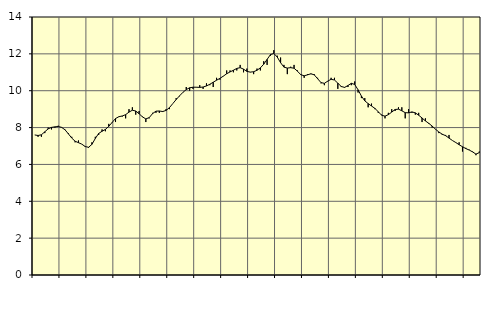
| Category | Piggar | Series 1 |
|---|---|---|
| nan | 7.6 | 7.6 |
| 87.0 | 7.5 | 7.57 |
| 87.0 | 7.5 | 7.61 |
| 87.0 | 7.7 | 7.77 |
| nan | 8 | 7.93 |
| 88.0 | 7.9 | 8.01 |
| 88.0 | 8 | 8.04 |
| 88.0 | 8.1 | 8.06 |
| nan | 8 | 8.01 |
| 89.0 | 7.9 | 7.88 |
| 89.0 | 7.7 | 7.66 |
| 89.0 | 7.5 | 7.43 |
| nan | 7.2 | 7.26 |
| 90.0 | 7.3 | 7.18 |
| 90.0 | 7.1 | 7.1 |
| 90.0 | 7 | 6.97 |
| nan | 6.9 | 6.93 |
| 91.0 | 7.2 | 7.09 |
| 91.0 | 7.5 | 7.41 |
| 91.0 | 7.6 | 7.68 |
| nan | 7.9 | 7.8 |
| 92.0 | 7.8 | 7.9 |
| 92.0 | 8.2 | 8.07 |
| 92.0 | 8.3 | 8.28 |
| nan | 8.3 | 8.49 |
| 93.0 | 8.6 | 8.59 |
| 93.0 | 8.6 | 8.63 |
| 93.0 | 8.5 | 8.7 |
| nan | 9 | 8.84 |
| 94.0 | 9.1 | 8.94 |
| 94.0 | 8.7 | 8.9 |
| 94.0 | 8.9 | 8.75 |
| nan | 8.6 | 8.58 |
| 95.0 | 8.3 | 8.47 |
| 95.0 | 8.5 | 8.54 |
| 95.0 | 8.8 | 8.76 |
| nan | 8.8 | 8.89 |
| 96.0 | 8.8 | 8.9 |
| 96.0 | 8.9 | 8.87 |
| 96.0 | 9 | 8.93 |
| nan | 9 | 9.08 |
| 97.0 | 9.3 | 9.3 |
| 97.0 | 9.6 | 9.52 |
| 97.0 | 9.7 | 9.72 |
| nan | 9.9 | 9.91 |
| 98.0 | 10.2 | 10.06 |
| 98.0 | 10 | 10.16 |
| 98.0 | 10.1 | 10.19 |
| nan | 10.2 | 10.19 |
| 99.0 | 10.3 | 10.18 |
| 99.0 | 10.1 | 10.2 |
| 99.0 | 10.4 | 10.26 |
| nan | 10.3 | 10.35 |
| 0.0 | 10.2 | 10.46 |
| 0.0 | 10.7 | 10.57 |
| 0.0 | 10.6 | 10.67 |
| nan | 10.8 | 10.79 |
| 1.0 | 11.1 | 10.92 |
| 1.0 | 11.1 | 11.02 |
| 1.0 | 11 | 11.11 |
| nan | 11.1 | 11.21 |
| 2.0 | 11.4 | 11.25 |
| 2.0 | 11 | 11.17 |
| 2.0 | 11.2 | 11.05 |
| nan | 11 | 11.01 |
| 3.0 | 10.9 | 11.03 |
| 3.0 | 11.2 | 11.11 |
| 3.0 | 11.1 | 11.24 |
| nan | 11.6 | 11.44 |
| 4.0 | 11.4 | 11.7 |
| 4.0 | 11.9 | 11.96 |
| 4.0 | 12.2 | 12.02 |
| nan | 11.9 | 11.83 |
| 5.0 | 11.8 | 11.52 |
| 5.0 | 11.4 | 11.28 |
| 5.0 | 10.9 | 11.23 |
| nan | 11.3 | 11.25 |
| 6.0 | 11.4 | 11.22 |
| 6.0 | 11.1 | 11.06 |
| 6.0 | 10.9 | 10.87 |
| nan | 10.7 | 10.81 |
| 7.0 | 10.9 | 10.86 |
| 7.0 | 10.9 | 10.92 |
| 7.0 | 10.9 | 10.86 |
| nan | 10.7 | 10.65 |
| 8.0 | 10.4 | 10.44 |
| 8.0 | 10.3 | 10.4 |
| 8.0 | 10.5 | 10.52 |
| nan | 10.7 | 10.62 |
| 9.0 | 10.7 | 10.58 |
| 9.0 | 10.1 | 10.41 |
| 9.0 | 10.2 | 10.23 |
| nan | 10.2 | 10.18 |
| 10.0 | 10.2 | 10.28 |
| 10.0 | 10.3 | 10.4 |
| 10.0 | 10.5 | 10.34 |
| nan | 9.9 | 10.05 |
| 11.0 | 9.6 | 9.71 |
| 11.0 | 9.6 | 9.45 |
| 11.0 | 9.1 | 9.3 |
| nan | 9.3 | 9.17 |
| 12.0 | 9 | 9.04 |
| 12.0 | 8.8 | 8.86 |
| 12.0 | 8.7 | 8.67 |
| nan | 8.5 | 8.62 |
| 13.0 | 8.8 | 8.7 |
| 13.0 | 9 | 8.84 |
| 13.0 | 8.9 | 8.98 |
| nan | 9.1 | 9 |
| 14.0 | 9.1 | 8.91 |
| 14.0 | 8.5 | 8.81 |
| 14.0 | 9 | 8.8 |
| nan | 8.8 | 8.85 |
| 15.0 | 8.7 | 8.8 |
| 15.0 | 8.8 | 8.67 |
| 15.0 | 8.3 | 8.52 |
| nan | 8.5 | 8.36 |
| 16.0 | 8.2 | 8.23 |
| 16.0 | 8 | 8.08 |
| 16.0 | 7.9 | 7.91 |
| nan | 7.7 | 7.76 |
| 17.0 | 7.6 | 7.64 |
| 17.0 | 7.6 | 7.56 |
| 17.0 | 7.6 | 7.43 |
| nan | 7.3 | 7.3 |
| 18.0 | 7.2 | 7.19 |
| 18.0 | 7.2 | 7.07 |
| 18.0 | 6.7 | 6.96 |
| nan | 6.9 | 6.86 |
| 19.0 | 6.8 | 6.78 |
| 19.0 | 6.7 | 6.68 |
| 19.0 | 6.5 | 6.56 |
| nan | 6.7 | 6.64 |